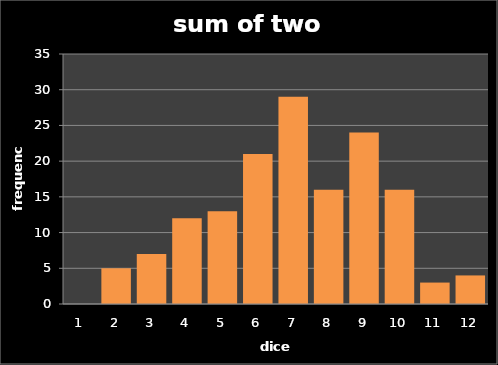
| Category | freq1 |
|---|---|
| 0 | 0 |
| 1 | 5 |
| 2 | 7 |
| 3 | 12 |
| 4 | 13 |
| 5 | 21 |
| 6 | 29 |
| 7 | 16 |
| 8 | 24 |
| 9 | 16 |
| 10 | 3 |
| 11 | 4 |